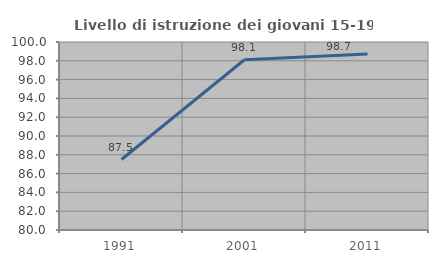
| Category | Livello di istruzione dei giovani 15-19 anni |
|---|---|
| 1991.0 | 87.5 |
| 2001.0 | 98.113 |
| 2011.0 | 98.734 |